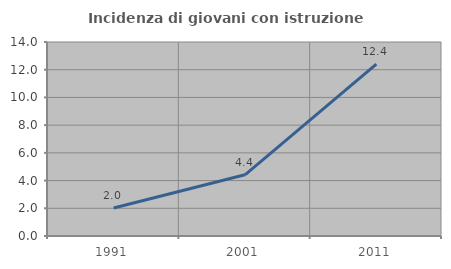
| Category | Incidenza di giovani con istruzione universitaria |
|---|---|
| 1991.0 | 2.02 |
| 2001.0 | 4.418 |
| 2011.0 | 12.397 |